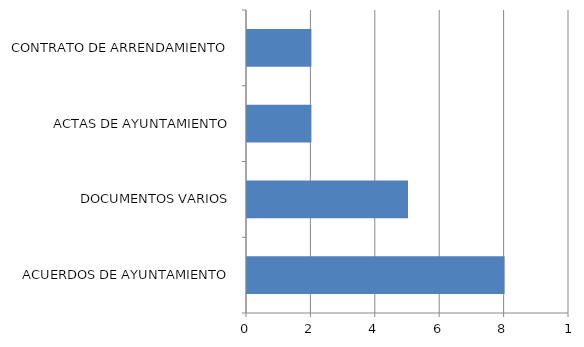
| Category | Series 0 |
|---|---|
| ACUERDOS DE AYUNTAMIENTO | 8 |
| DOCUMENTOS VARIOS | 5 |
| ACTAS DE AYUNTAMIENTO | 2 |
| CONTRATO DE ARRENDAMIENTO | 2 |